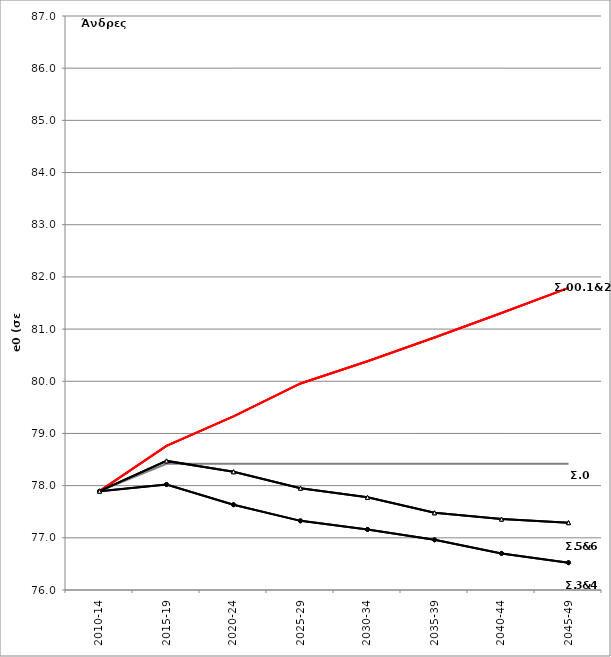
| Category | Σ0.e0 | Σ00.e0 | Σ1.e0 | Σ2.e0 | Σ3.e0 | Σ4.e0 | Σ5.e0 | Σ6.e0 |
|---|---|---|---|---|---|---|---|---|
| 2010-14 | 77.893 | 77.893 | 77.893 | 77.893 | 77.893 | 77.893 | 77.893 | 77.893 |
| 2015-19 | 78.419 | 78.761 | 78.761 | 78.761 | 78.02 | 78.02 | 78.474 | 78.474 |
| 2020-24 | 78.419 | 79.326 | 79.326 | 79.326 | 77.634 | 77.634 | 78.266 | 78.266 |
| 2025-29 | 78.419 | 79.959 | 79.959 | 79.959 | 77.325 | 77.325 | 77.952 | 77.952 |
| 2030-34 | 78.419 | 80.382 | 80.382 | 80.382 | 77.16 | 77.16 | 77.776 | 77.776 |
| 2035-39 | 78.419 | 80.838 | 80.838 | 80.838 | 76.962 | 76.962 | 77.479 | 77.479 |
| 2040-44 | 78.419 | 81.31 | 81.31 | 81.31 | 76.701 | 76.701 | 77.359 | 77.359 |
| 2045-49 | 78.419 | 81.791 | 81.791 | 81.791 | 76.523 | 76.523 | 77.291 | 77.291 |